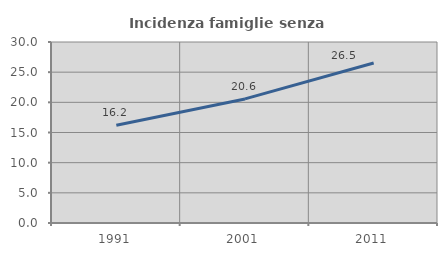
| Category | Incidenza famiglie senza nuclei |
|---|---|
| 1991.0 | 16.202 |
| 2001.0 | 20.564 |
| 2011.0 | 26.526 |